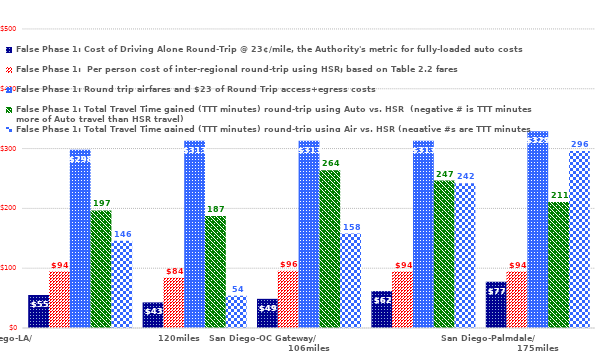
| Category | False Phase 1: Cost of Driving Alone Round-Trip @ 23¢/mile, the Authority's metric for fully-loaded auto costs | False Phase 1:  Per person cost of inter-regional round-trip using HSR; based on Table 2.2 fares | False Phase 1: Round trip airfares and $23 of Round Trip access+egress costs | False Phase 1: Total Travel Time gained (TTT minutes) round-trip using Auto vs. HSR  (negative # is TTT minutes more of Auto travel than HSR travel) | False Phase 1: Total Travel Time gained (TTT minutes) round-trip using Air vs. HSR (negative #s are TTT minutes saved by HSR travelers over Air travelers) |
|---|---|---|---|---|---|
| San Diego-LA/                                          120miles | 55.2 | 94.3 | 298 | 196.5 | 146 |
| San Diego-Anaheim/                                      93miles | 42.78 | 83.9 | 313 | 187.3 | 54 |
| San Diego-OC Gateway/                                  106miles | 48.76 | 95.9 | 313 | 263.7 | 158 |
| San Diego-BUR/                                                 126miles | 61.64 | 94.3 | 313 | 246.5 | 242 |
| San Diego-Palmdale/                                     175miles | 77.28 | 94.3 | 329 | 210.8 | 296 |